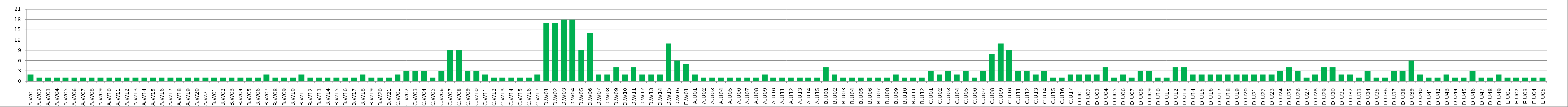
| Category | Series 0 |
|---|---|
| A.W01 | 2 |
| A.W02 | 1 |
| A.W03 | 1 |
| A.W04 | 1 |
| A.W05 | 1 |
| A.W06 | 1 |
| A.W07 | 1 |
| A.W08 | 1 |
| A.W09 | 1 |
| A.W10 | 1 |
| A.W11 | 1 |
| A.W12 | 1 |
| A.W13 | 1 |
| A.W14 | 1 |
| A.W15 | 1 |
| A.W16 | 1 |
| A.W17 | 1 |
| A.W18 | 1 |
| A.W19 | 1 |
| A.W20 | 1 |
| A.W21 | 1 |
| B.W01 | 1 |
| B.W02 | 1 |
| B.W03 | 1 |
| B.W04 | 1 |
| B.W05 | 1 |
| B.W06 | 1 |
| B.W07 | 2 |
| B.W08 | 1 |
| B.W09 | 1 |
| B.W10 | 1 |
| B.W11 | 2 |
| B.W12 | 1 |
| B.W13 | 1 |
| B.W14 | 1 |
| B.W15 | 1 |
| B.W16 | 1 |
| B.W17 | 1 |
| B.W18 | 2 |
| B.W19 | 1 |
| B.W20 | 1 |
| B.W21 | 1 |
| C.W01 | 2 |
| C.W02 | 3 |
| C.W03 | 3 |
| C.W04 | 3 |
| C.W05 | 1 |
| C.W06 | 3 |
| C.W07 | 9 |
| C.W08 | 9 |
| C.W09 | 3 |
| C.W10 | 3 |
| C.W11 | 2 |
| C.W12 | 1 |
| C.W13 | 1 |
| C.W14 | 1 |
| C.W15 | 1 |
| C.W16 | 1 |
| C.W17 | 2 |
| D.W01 | 17 |
| D.W02 | 17 |
| D.W03 | 18 |
| D.W04 | 18 |
| D.W05 | 9 |
| D.W06 | 14 |
| D.W07 | 2 |
| D.W08 | 2 |
| D.W09 | 4 |
| D.W10 | 2 |
| D.W11 | 4 |
| D.W12 | 2 |
| D.W13 | 2 |
| D.W14 | 2 |
| D.W15 | 11 |
| D.W16 | 6 |
| E.W01 | 5 |
| A.U01 | 2 |
| A.U02 | 1 |
| A.U03 | 1 |
| A.U04 | 1 |
| A.U05 | 1 |
| A.U06 | 1 |
| A.U07 | 1 |
| A.U08 | 1 |
| A.U09 | 2 |
| A.U10 | 1 |
| A.U11 | 1 |
| A.U12 | 1 |
| A.U13 | 1 |
| A.U14 | 1 |
| A.U15 | 1 |
| B.U01 | 4 |
| B.U02 | 2 |
| B.U03 | 1 |
| B.U04 | 1 |
| B.U05 | 1 |
| B.U06 | 1 |
| B.U07 | 1 |
| B.U08 | 1 |
| B.U09 | 2 |
| B.U10 | 1 |
| B.U11 | 1 |
| B.U12 | 1 |
| C.U01 | 3 |
| C.U02 | 2 |
| C.U03 | 3 |
| C.U04 | 2 |
| C.U05 | 3 |
| C.U06 | 1 |
| C.U07 | 3 |
| C.U08 | 8 |
| C.U09 | 11 |
| C.U10 | 9 |
| C.U11 | 3 |
| C.U12 | 3 |
| C.U13 | 2 |
| C.U14 | 3 |
| C.U15 | 1 |
| C.U16 | 1 |
| C.U17 | 2 |
| D.U01 | 2 |
| D.U02 | 2 |
| D.U03 | 2 |
| D.U04 | 4 |
| D.U05 | 1 |
| D.U06 | 2 |
| D.U07 | 1 |
| D.U08 | 3 |
| D.U09 | 3 |
| D.U10 | 1 |
| D.U11 | 1 |
| D.U12 | 4 |
| D.U13 | 4 |
| D.U14 | 2 |
| D.U15 | 2 |
| D.U16 | 2 |
| D.U17 | 2 |
| D.U18 | 2 |
| D.U19 | 2 |
| D.U20 | 2 |
| D.U21 | 2 |
| D.U22 | 2 |
| D.U23 | 2 |
| D.U24 | 3 |
| D.U25 | 4 |
| D.U26 | 3 |
| D.U27 | 1 |
| D.U28 | 2 |
| D.U29 | 4 |
| D.U30 | 4 |
| D.U31 | 2 |
| D.U32 | 2 |
| D.U33 | 1 |
| D.U34 | 3 |
| D.U35 | 1 |
| D.U36 | 1 |
| D.U37 | 3 |
| D.U38 | 3 |
| D.U39 | 6 |
| D.U40 | 2 |
| D.U41 | 1 |
| D.U42 | 1 |
| D.U43 | 2 |
| D.U44 | 1 |
| D.U45 | 1 |
| D.U46 | 3 |
| D.U47 | 1 |
| D.U48 | 1 |
| D.U49 | 2 |
| E.U01 | 1 |
| E.U02 | 1 |
| E.U03 | 1 |
| E.U04 | 1 |
| E.U05 | 1 |